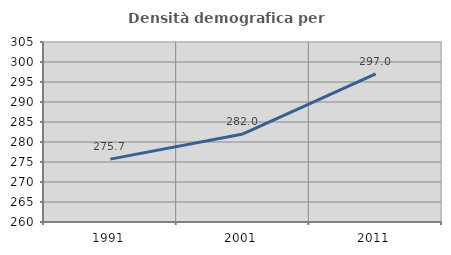
| Category | Densità demografica |
|---|---|
| 1991.0 | 275.723 |
| 2001.0 | 282.02 |
| 2011.0 | 297.043 |